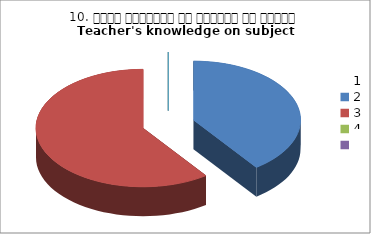
| Category | 10. विषय अवधारणा पर शिक्षक का ज्ञान
Teacher's knowledge on subject concept?
 |
|---|---|
| 0 | 2 |
| 1 | 3 |
| 2 | 0 |
| 3 | 0 |
| 4 | 0 |